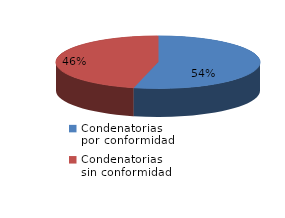
| Category | Series 0 |
|---|---|
| 0 | 113 |
| 1 | 97 |